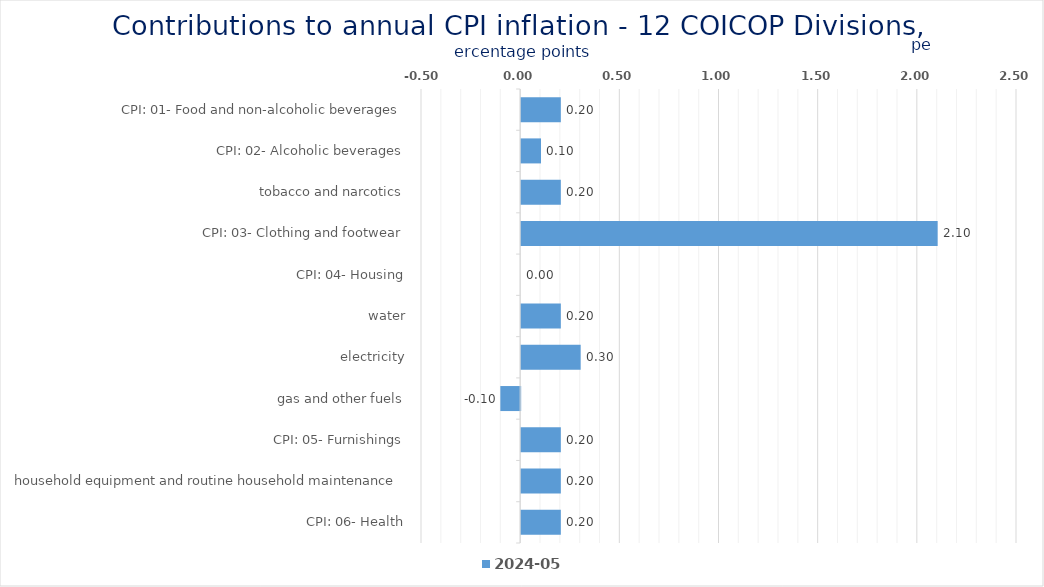
| Category | 2024-05 |
|---|---|
| CPI: 01- Food and non-alcoholic beverages | 0.2 |
| CPI: 02- Alcoholic beverages, tobacco and narcotics | 0.1 |
| CPI: 03- Clothing and footwear | 0.2 |
| CPI: 04- Housing, water, electricity, gas and other fuels | 2.1 |
| CPI: 05- Furnishings, household equipment and routine household maintenance | 0 |
| CPI: 06- Health | 0.2 |
| CPI: 07- Transport | 0.3 |
| CPI: 08- Communication | -0.1 |
| CPI: 09- Recreation and culture | 0.2 |
| CPI: 11- Restaurants and hotels | 0.2 |
| CPI: 12- Miscellaneous goods and services | 0.2 |